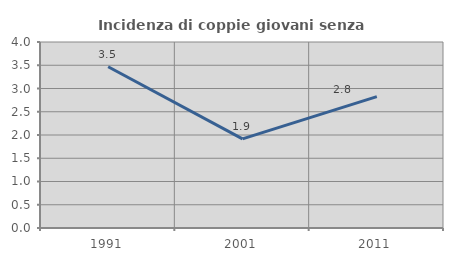
| Category | Incidenza di coppie giovani senza figli |
|---|---|
| 1991.0 | 3.468 |
| 2001.0 | 1.916 |
| 2011.0 | 2.825 |